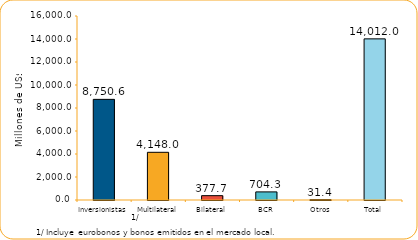
| Category | Series 1 |
|---|---|
| Inversionistas | 8750.6 |
| Multilateral | 4148 |
| Bilateral | 377.7 |
| BCR | 704.3 |
| Otros | 31.4 |
| Total | 14012 |